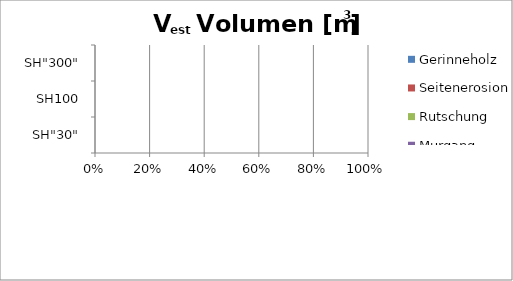
| Category | Gerinneholz | Seitenerosion | Rutschung | Murgang |
|---|---|---|---|---|
| SH"30" | 0 | 0 | 0 | 0 |
| SH100 | 0 | 0 | 0 | 0 |
| SH"300" | 0 | 0 | 0 | 0 |